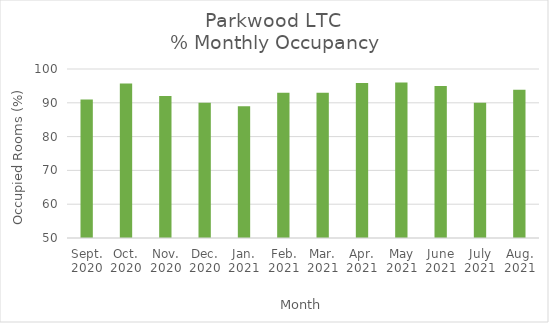
| Category | % Monthly Occupancy |
|---|---|
| Sept.
2020 | 91 |
| Oct.
2020 | 95.7 |
| Nov.
2020 | 92 |
| Dec.
2020 | 90 |
| Jan.
2021 | 89 |
| Feb.
2021 | 93 |
| Mar.
2021 | 93 |
| Apr.
2021 | 95.83 |
| May
2021 | 96 |
| June
2021 | 95 |
| July
2021 | 90 |
| Aug.
2021 | 93.88 |